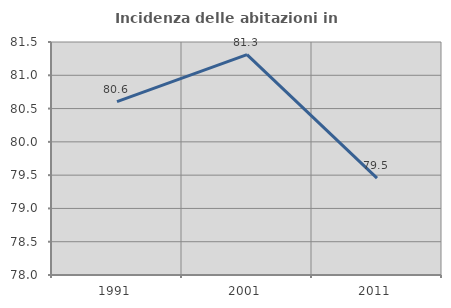
| Category | Incidenza delle abitazioni in proprietà  |
|---|---|
| 1991.0 | 80.603 |
| 2001.0 | 81.311 |
| 2011.0 | 79.454 |